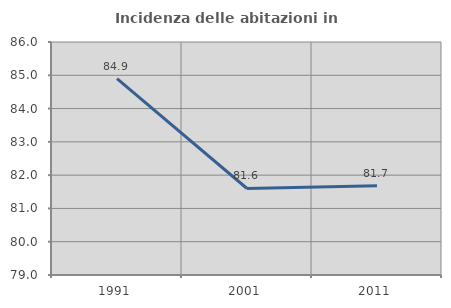
| Category | Incidenza delle abitazioni in proprietà  |
|---|---|
| 1991.0 | 84.897 |
| 2001.0 | 81.599 |
| 2011.0 | 81.682 |